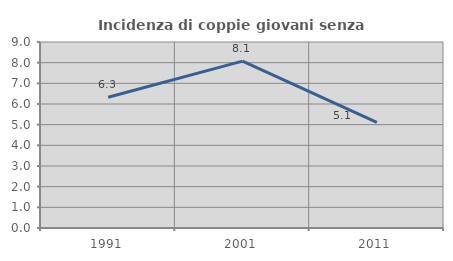
| Category | Incidenza di coppie giovani senza figli |
|---|---|
| 1991.0 | 6.326 |
| 2001.0 | 8.076 |
| 2011.0 | 5.115 |